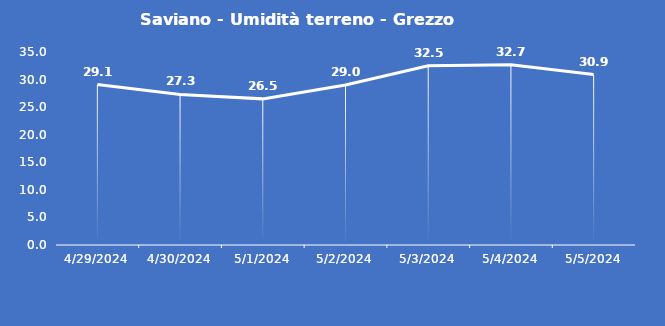
| Category | Saviano - Umidità terreno - Grezzo (%VWC) |
|---|---|
| 4/29/24 | 29.1 |
| 4/30/24 | 27.3 |
| 5/1/24 | 26.5 |
| 5/2/24 | 29 |
| 5/3/24 | 32.5 |
| 5/4/24 | 32.7 |
| 5/5/24 | 30.9 |